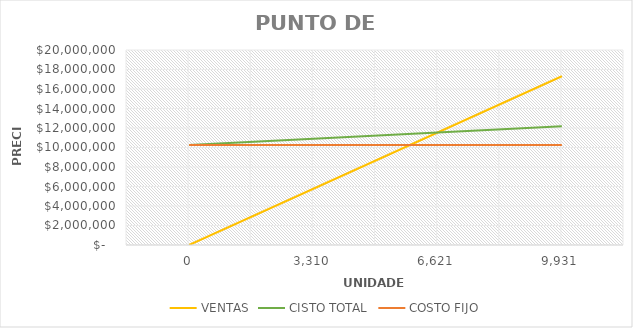
| Category | VENTAS | CISTO TOTAL | COSTO FIJO |
|---|---|---|---|
| 0.0 | 0 | 10259805.507 | 10259805.507 |
| 3310.361051611533 | 5769959.313 | 10899862.066 | 10259805.507 |
| 6620.722103223066 | 11539918.626 | 11539918.626 | 10259805.507 |
| 9931.0831548346 | 17309877.939 | 12179975.186 | 10259805.507 |